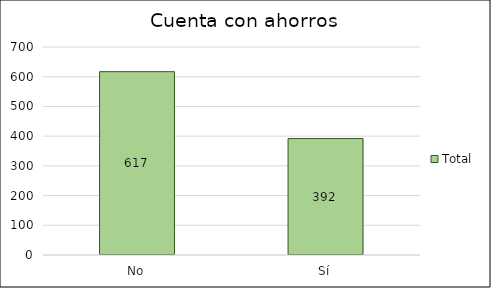
| Category | Total |
|---|---|
| No | 617 |
| Sí | 392 |